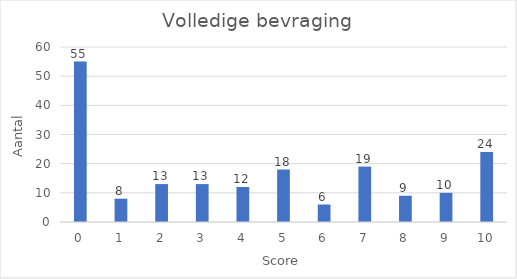
| Category | Aantal |
|---|---|
| 0.0 | 55 |
| 1.0 | 8 |
| 2.0 | 13 |
| 3.0 | 13 |
| 4.0 | 12 |
| 5.0 | 18 |
| 6.0 | 6 |
| 7.0 | 19 |
| 8.0 | 9 |
| 9.0 | 10 |
| 10.0 | 24 |